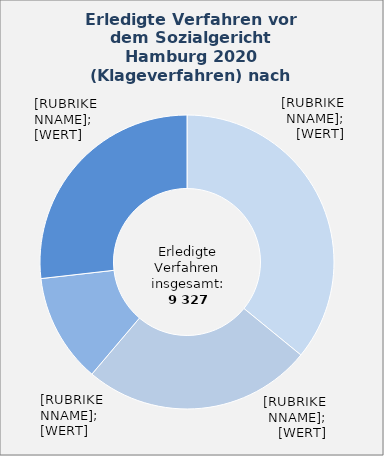
| Category | in Prozent |
|---|---|
| Krankenversicherung | 35.9 |
| Angelegenheiten nach dem SGB II | 25.3 |
| Rentenversicherung | 12 |
| Übrige Sachgebiete¹ | 26.8 |